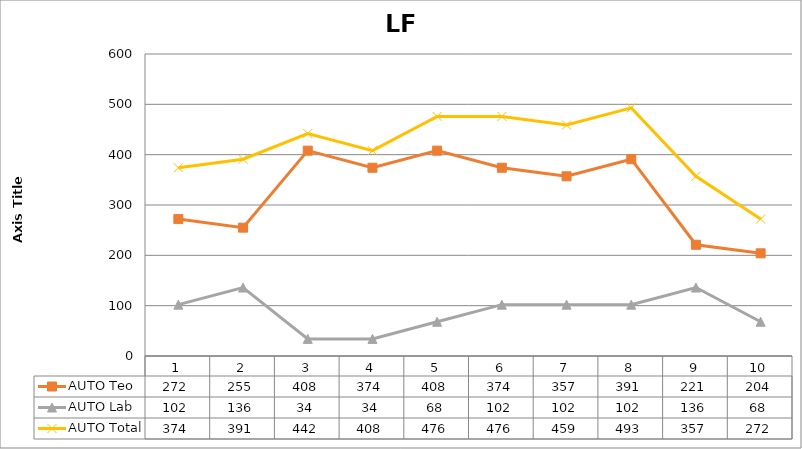
| Category | AUTO Teo | AUTO Lab | AUTO Total |
|---|---|---|---|
| 1.0 | 272 | 102 | 374 |
| 2.0 | 255 | 136 | 391 |
| 3.0 | 408 | 34 | 442 |
| 4.0 | 374 | 34 | 408 |
| 5.0 | 408 | 68 | 476 |
| 6.0 | 374 | 102 | 476 |
| 7.0 | 357 | 102 | 459 |
| 8.0 | 391 | 102 | 493 |
| 9.0 | 221 | 136 | 357 |
| 10.0 | 204 | 68 | 272 |